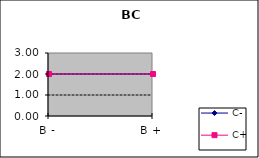
| Category | C- | C+ |
|---|---|---|
| B - | 2 | 2 |
| B + | 2 | 2 |